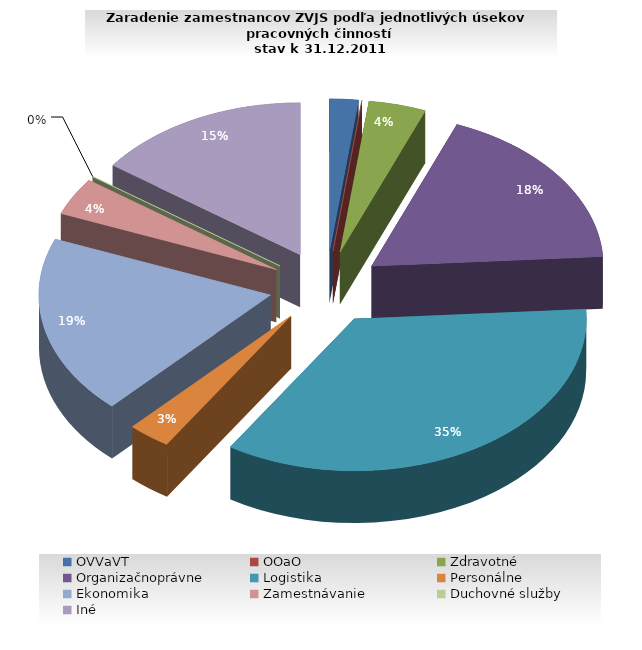
| Category | Series 0 |
|---|---|
| OVVaVT | 2 |
| OOaO | 0 |
| Zdravotné | 4 |
| Organizačnoprávne | 18 |
| Logistika | 35 |
| Personálne | 3 |
| Ekonomika | 19 |
| Zamestnávanie | 4 |
| Duchovné služby | 0 |
| Iné | 15 |